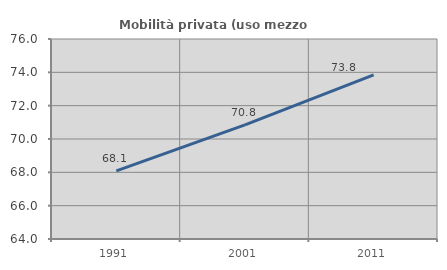
| Category | Mobilità privata (uso mezzo privato) |
|---|---|
| 1991.0 | 68.089 |
| 2001.0 | 70.849 |
| 2011.0 | 73.849 |